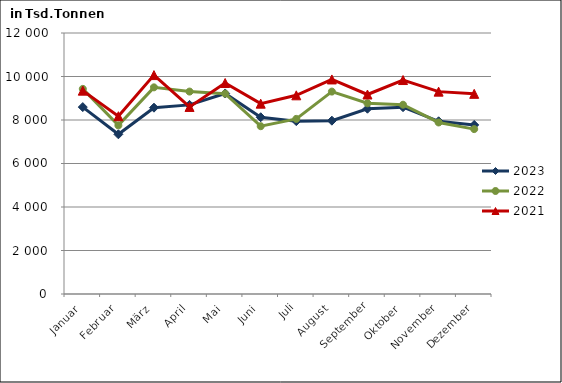
| Category | 2023 | 2022 | 2021 |
|---|---|---|---|
| Januar | 8593.983 | 9430.962 | 9349.531 |
| Februar | 7343.107 | 7753.37 | 8173.379 |
| März | 8566.401 | 9500.936 | 10065.082 |
| April | 8694.94 | 9306.801 | 8600.521 |
| Mai | 9220.707 | 9212.06 | 9700.58 |
| Juni | 8126.485 | 7714.598 | 8750.88 |
| Juli | 7947.483 | 8050.544 | 9134.854 |
| August | 7969.13 | 9306.311 | 9864.506 |
| September | 8518.979 | 8767.999 | 9172.31 |
| Oktober | 8589.058 | 8702.329 | 9837.214 |
| November | 7940.424 | 7887.131 | 9304.301 |
| Dezember | 7772.329 | 7581.577 | 9202.63 |